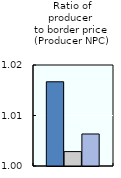
| Category | 1986-88 | 2000-02 | 2016-18 |
|---|---|---|---|
| Ratio of producer 
to border price 
(Producer NPC) | 1.017 | 1.003 | 1.006 |